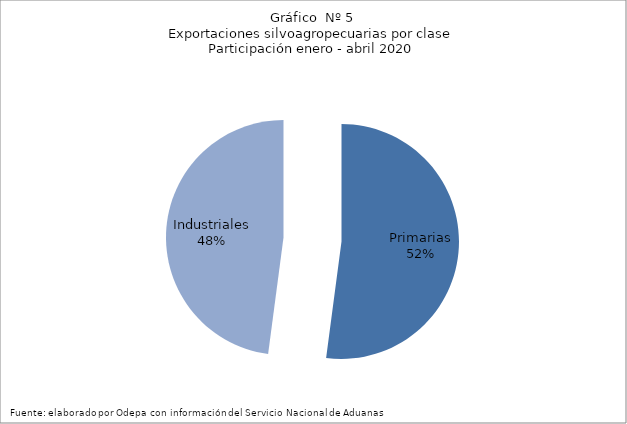
| Category | Series 0 |
|---|---|
| Primarias | 3046393 |
| Industriales | 2802085 |